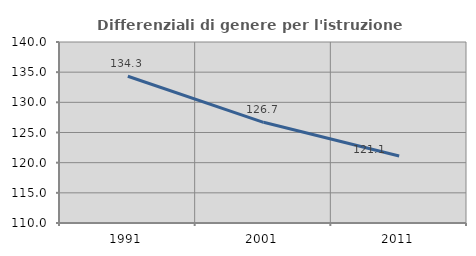
| Category | Differenziali di genere per l'istruzione superiore |
|---|---|
| 1991.0 | 134.325 |
| 2001.0 | 126.691 |
| 2011.0 | 121.102 |